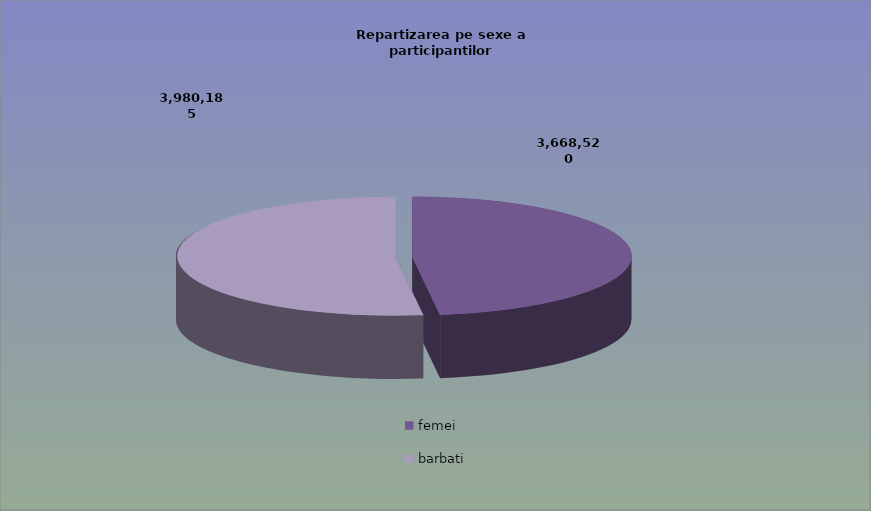
| Category | Series 0 |
|---|---|
| femei | 3668520 |
| barbati | 3980185 |